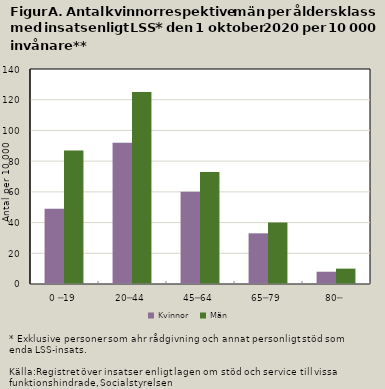
| Category | Kvinnor | Män |
|---|---|---|
| 0 ─19 | 49 | 87 |
| 20─44 | 92 | 125 |
| 45─64 | 60 | 73 |
| 65─79 | 33 | 40 |
| 80─ | 8 | 10 |